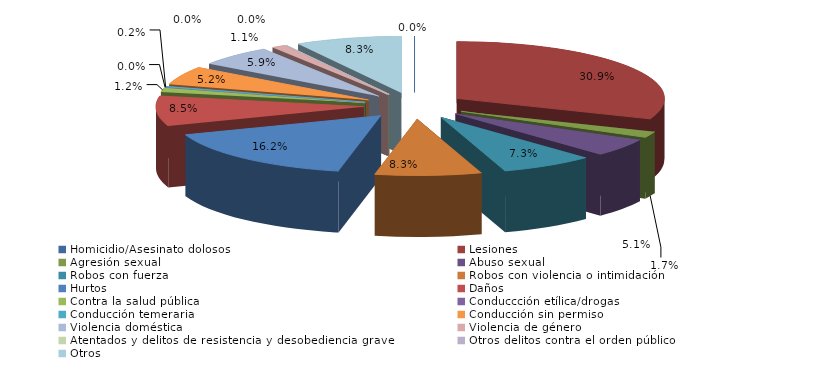
| Category | Series 0 |
|---|---|
| Homicidio/Asesinato dolosos | 0 |
| Lesiones | 377 |
| Agresión sexual | 21 |
| Abuso sexual | 62 |
| Robos con fuerza | 89 |
| Robos con violencia o intimidación | 101 |
| Hurtos | 198 |
| Daños | 104 |
| Contra la salud pública | 15 |
| Conduccción etílica/drogas | 0 |
| Conducción temeraria | 3 |
| Conducción sin permiso | 64 |
| Violencia doméstica | 72 |
| Violencia de género | 13 |
| Atentados y delitos de resistencia y desobediencia grave | 0 |
| Otros delitos contra el orden público | 0 |
| Otros | 101 |